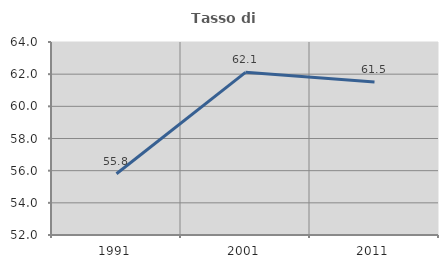
| Category | Tasso di occupazione   |
|---|---|
| 1991.0 | 55.81 |
| 2001.0 | 62.115 |
| 2011.0 | 61.511 |